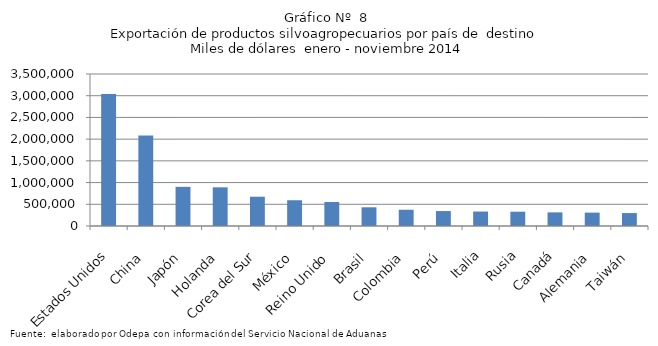
| Category | Series 0 |
|---|---|
| Estados Unidos | 3038255.211 |
| China | 2082401.392 |
| Japón | 901698.872 |
| Holanda | 890487.023 |
| Corea del Sur | 674519.944 |
| México | 593240.368 |
| Reino Unido | 552241.975 |
| Brasil | 430800.869 |
| Colombia | 374739.276 |
| Perú | 343986.804 |
| Italia | 332955.642 |
| Rusia | 329205.185 |
| Canadá | 314139.372 |
| Alemania | 308078.593 |
| Taiwán | 297845.733 |